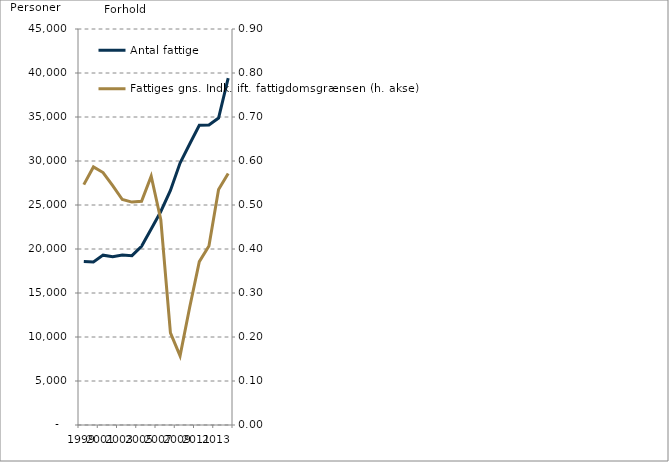
| Category | Antal fattige |
|---|---|
| 1999.0 | 18587 |
| 2000.0 | 18521 |
| 2001.0 | 19301 |
| 2002.0 | 19123 |
| 2003.0 | 19312 |
| 2004.0 | 19239 |
| 2005.0 | 20303 |
| 2006.0 | 22272 |
| 2007.0 | 24266 |
| 2008.0 | 26659 |
| 2009.0 | 29765 |
| 2010.0 | 31931 |
| 2011.0 | 34059 |
| 2012.0 | 34088 |
| 2013.0 | 34878 |
| 2014.0 | 39413 |